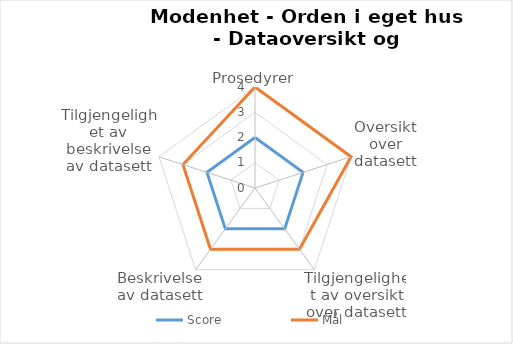
| Category | Score | Mål |
|---|---|---|
| Prosedyrer | 2 | 4 |
| Oversikt over datasett | 2 | 4 |
| Tilgjengelighet av oversikt over datasett | 2 | 3 |
| Beskrivelse av datasett | 2 | 3 |
| Tilgjengelighet av beskrivelse av datasett | 2 | 3 |